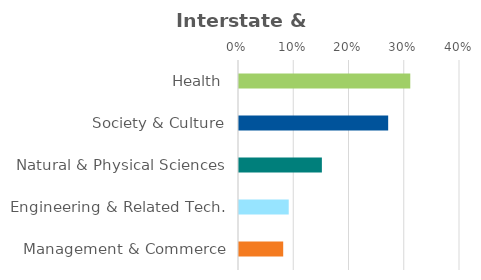
| Category | Series 0 |
|---|---|
| Health | 0.31 |
| Society & Culture | 0.27 |
| Natural & Physical Sciences | 0.15 |
| Engineering & Related Tech. | 0.09 |
| Management & Commerce | 0.08 |